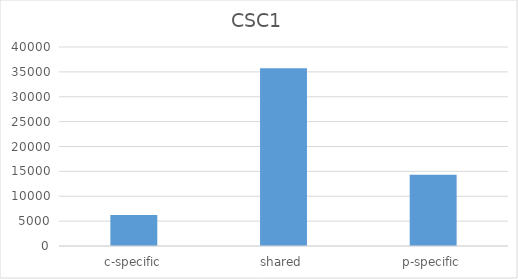
| Category | CSC1 |
|---|---|
| c-specific | 6211 |
| shared | 35744 |
| p-specific | 14307 |